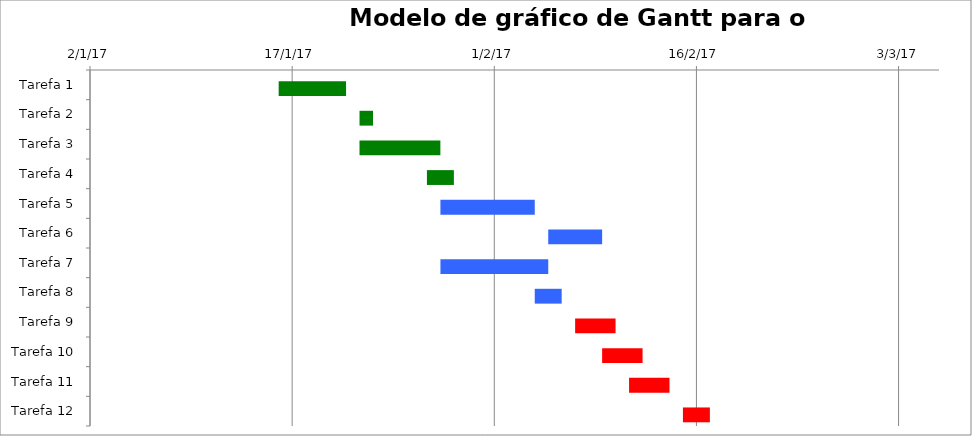
| Category | Início | Duração (dias) |
|---|---|---|
| Tarefa 1 | 2017-01-16 | 5 |
| Tarefa 2 | 2017-01-22 | 1 |
| Tarefa 3 | 2017-01-22 | 6 |
| Tarefa 4 | 2017-01-27 | 2 |
| Tarefa 5 | 2017-01-28 | 7 |
| Tarefa 6 | 2017-02-05 | 4 |
| Tarefa 7 | 2017-01-28 | 8 |
| Tarefa 8 | 2017-02-04 | 2 |
| Tarefa 9 | 2017-02-07 | 3 |
| Tarefa 10 | 2017-02-09 | 3 |
| Tarefa 11 | 2017-02-11 | 3 |
| Tarefa 12 | 2017-02-15 | 2 |